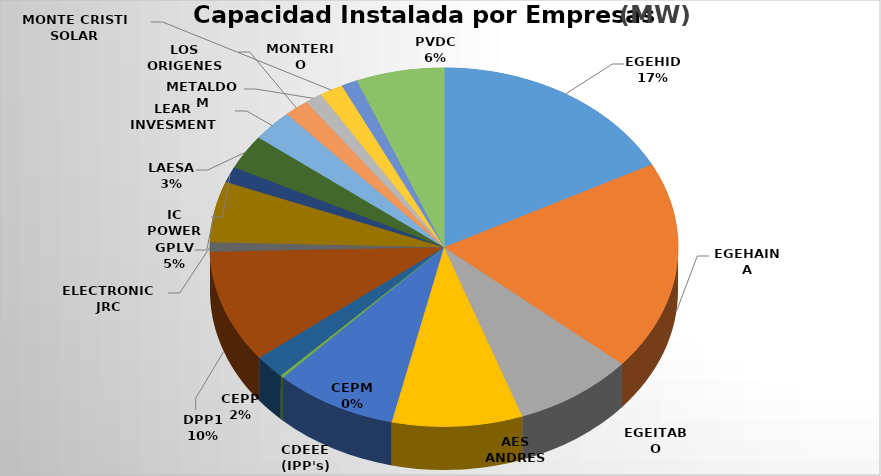
| Category | Potencia     (MW) | % |
|---|---|---|
| EGEHID | 615.7 | 0.159 |
| EGEHAINA | 670 | 0.173 |
| EGEITABO | 294.5 | 0.076 |
| AES ANDRES | 319 | 0.082 |
| CDEEE (IPP's) | 300 | 0.078 |
| CEPM | 8.3 | 0.002 |
| CEPP | 76.8 | 0.02 |
| DPP1 | 359.3 | 0.093 |
| ELECTRONIC JRC | 30 | 0.008 |
| GPLV | 194.5 | 0.05 |
| IC POWER | 50 | 0.013 |
| LAESA | 111.2 | 0.029 |
| LEAR INVESMENT | 100.1 | 0.026 |
| LOS ORIGENES | 60.7 | 0.016 |
| METALDOM | 42 | 0.011 |
| MONTE CRISTI SOLAR | 58 | 0.015 |
| MONTERIO | 39.4 | 0.01 |
| PVDC | 215 | 0.056 |